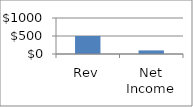
| Category | Series 0 |
|---|---|
| Rev | 500 |
| Net Income | 100 |